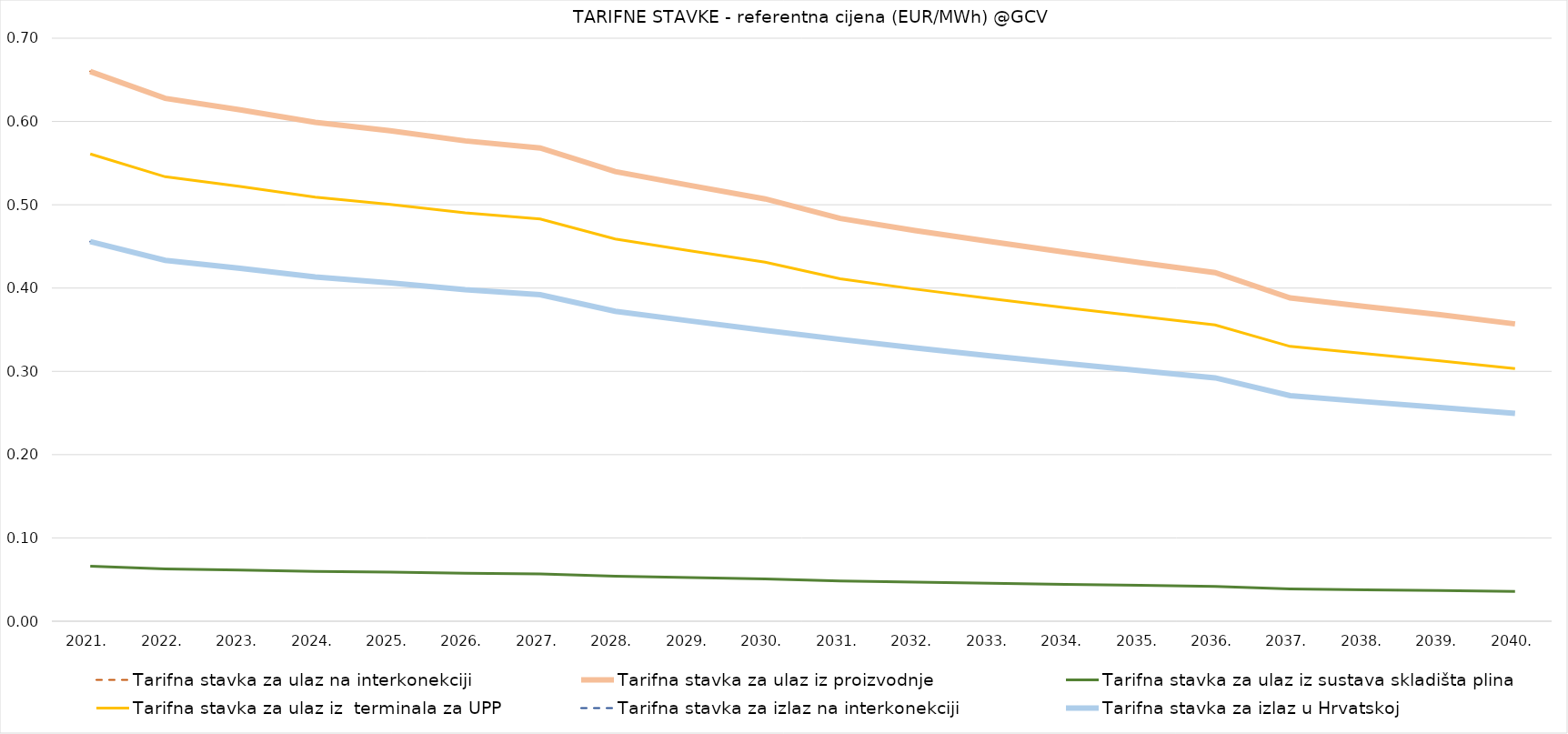
| Category | Tarifna stavka za ulaz na interkonekciji | Tarifna stavka za ulaz iz proizvodnje | Tarifna stavka za ulaz iz sustava skladišta plina | Tarifna stavka za ulaz iz  terminala za UPP | Tarifna stavka za izlaz na interkonekciji | Tarifna stavka za izlaz u Hrvatskoj |
|---|---|---|---|---|---|---|
| 2021. | 0.66 | 0.66 | 0.066 | 0.561 | 0.456 | 0.456 |
| 2022. | 0.628 | 0.628 | 0.063 | 0.534 | 0.433 | 0.433 |
| 2023. | 0.614 | 0.614 | 0.061 | 0.522 | 0.424 | 0.424 |
| 2024. | 0.599 | 0.599 | 0.06 | 0.509 | 0.413 | 0.413 |
| 2025. | 0.589 | 0.589 | 0.059 | 0.5 | 0.406 | 0.406 |
| 2026. | 0.577 | 0.577 | 0.058 | 0.49 | 0.398 | 0.398 |
| 2027. | 0.568 | 0.568 | 0.057 | 0.483 | 0.392 | 0.392 |
| 2028. | 0.54 | 0.54 | 0.054 | 0.459 | 0.372 | 0.372 |
| 2029. | 0.523 | 0.523 | 0.052 | 0.445 | 0.36 | 0.36 |
| 2030. | 0.507 | 0.507 | 0.051 | 0.431 | 0.349 | 0.349 |
| 2031. | 0.484 | 0.484 | 0.048 | 0.411 | 0.338 | 0.338 |
| 2032. | 0.469 | 0.469 | 0.047 | 0.399 | 0.328 | 0.328 |
| 2033. | 0.456 | 0.456 | 0.046 | 0.387 | 0.319 | 0.319 |
| 2034. | 0.443 | 0.443 | 0.044 | 0.377 | 0.31 | 0.31 |
| 2035. | 0.431 | 0.431 | 0.043 | 0.366 | 0.301 | 0.301 |
| 2036. | 0.419 | 0.419 | 0.042 | 0.356 | 0.292 | 0.292 |
| 2037. | 0.388 | 0.388 | 0.039 | 0.33 | 0.271 | 0.271 |
| 2038. | 0.378 | 0.378 | 0.038 | 0.321 | 0.264 | 0.264 |
| 2039. | 0.368 | 0.368 | 0.037 | 0.313 | 0.257 | 0.257 |
| 2040. | 0.357 | 0.357 | 0.036 | 0.303 | 0.25 | 0.25 |